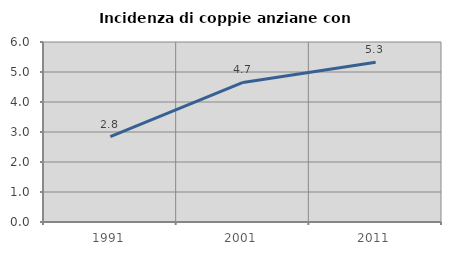
| Category | Incidenza di coppie anziane con figli |
|---|---|
| 1991.0 | 2.847 |
| 2001.0 | 4.651 |
| 2011.0 | 5.325 |